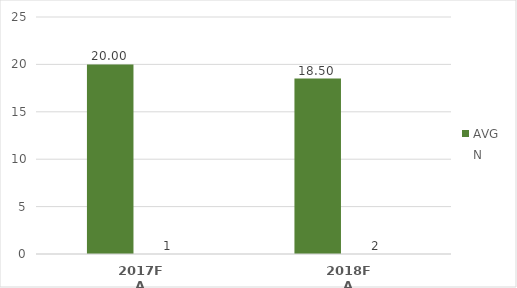
| Category | AVG | N |
|---|---|---|
| 2017FA | 20 | 1 |
| 2018FA | 18.5 | 2 |